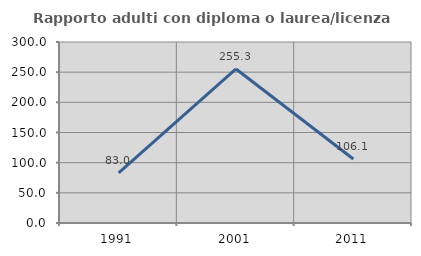
| Category | Rapporto adulti con diploma o laurea/licenza media  |
|---|---|
| 1991.0 | 82.979 |
| 2001.0 | 255.319 |
| 2011.0 | 106.098 |